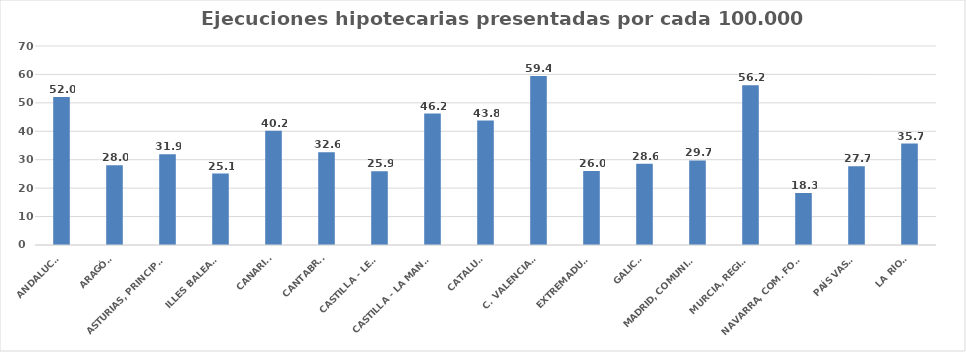
| Category | Series 0 |
|---|---|
| ANDALUCÍA | 52.04 |
| ARAGÓN | 28.014 |
| ASTURIAS, PRINCIPADO | 31.889 |
| ILLES BALEARS | 25.109 |
| CANARIAS | 40.173 |
| CANTABRIA | 32.624 |
| CASTILLA - LEÓN | 25.938 |
| CASTILLA - LA MANCHA | 46.236 |
| CATALUÑA | 43.765 |
| C. VALENCIANA | 59.407 |
| EXTREMADURA | 25.989 |
| GALICIA | 28.559 |
| MADRID, COMUNIDAD | 29.727 |
| MURCIA, REGIÓN | 56.161 |
| NAVARRA, COM. FORAL | 18.298 |
| PAÍS VASCO | 27.704 |
| LA RIOJA | 35.685 |